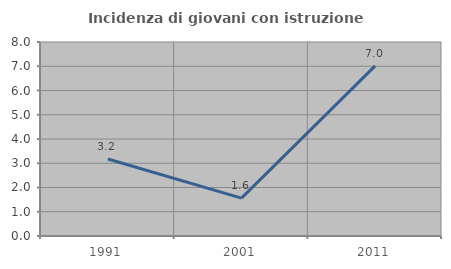
| Category | Incidenza di giovani con istruzione universitaria |
|---|---|
| 1991.0 | 3.175 |
| 2001.0 | 1.562 |
| 2011.0 | 7.018 |